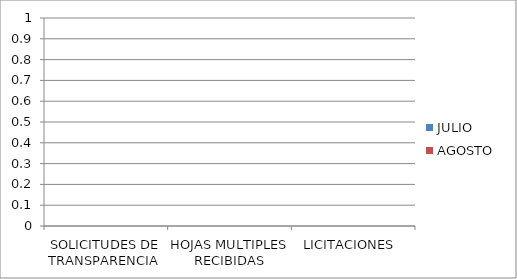
| Category | JULIO | AGOSTO  |
|---|---|---|
| SOLICITUDES DE TRANSPARENCIA  | 0 | 0 |
| HOJAS MULTIPLES RECIBIDAS | 0 | 0 |
| LICITACIONES  | 0 | 0 |